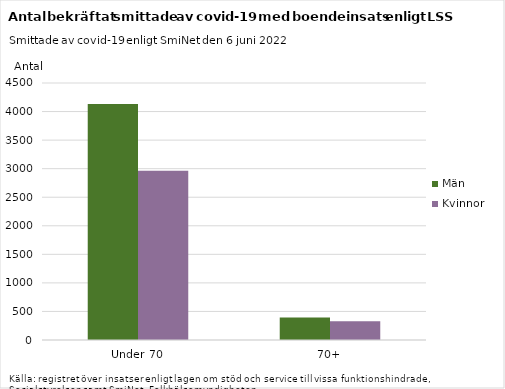
| Category | Män | Kvinnor |
|---|---|---|
| Under 70 | 4134 | 2965 |
| 70+ | 392 | 330 |